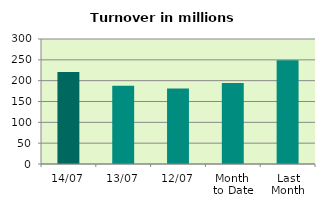
| Category | Series 0 |
|---|---|
| 14/07 | 220.929 |
| 13/07 | 187.534 |
| 12/07 | 181.045 |
| Month 
to Date | 194.432 |
| Last
Month | 248.976 |